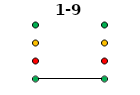
| Category | 0 | 1 | 2 | 3 | 1-9 |
|---|---|---|---|---|---|
| Time 1 | 0 | 1 | 2 | 3 | 0 |
| Time 2 | 0 | 1 | 2 | 3 | 0 |